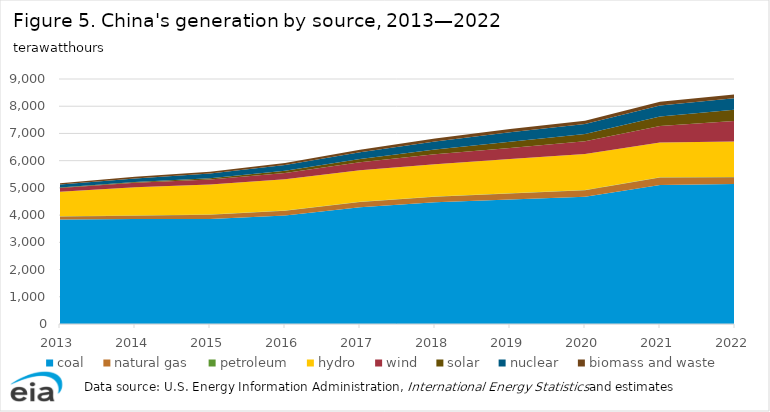
| Category | coal | natural gas | petroleum | hydro | wind | solar | nuclear | biomass and waste |
|---|---|---|---|---|---|---|---|---|
| 2013.0 | 3837.707 | 109.547 | 9.424 | 900.515 | 141.197 | 15.477 | 111.61 | 49.303 |
| 2014.0 | 3853.978 | 122.213 | 8.727 | 1040.626 | 159.979 | 29.23 | 132.54 | 57.356 |
| 2015.0 | 3853.377 | 158.954 | 9.218 | 1103.325 | 185.766 | 44.809 | 170.79 | 63.729 |
| 2016.0 | 3981.246 | 180.348 | 9.93 | 1141.716 | 237.07 | 75.344 | 213.29 | 76.113 |
| 2017.0 | 4285.387 | 196.565 | 9.547 | 1153.461 | 297.23 | 117.842 | 248.07 | 92.816 |
| 2018.0 | 4471.577 | 202.276 | 10.195 | 1186.898 | 365.971 | 177.28 | 294.36 | 103.207 |
| 2019.0 | 4573.457 | 219.009 | 9.918 | 1259.813 | 406.032 | 225.395 | 348.35 | 121.143 |
| 2020.0 | 4675.296 | 239.846 | 10.895 | 1321.511 | 466.462 | 262.184 | 366.25 | 124.262 |
| 2021.0 | 5105.576 | 275.072 | 11.306 | 1274.63 | 611.221 | 340.862 | 407.52 | 136.434 |
| 2022.0 | 5144.76 | 245.292 | 11.975 | 1300.452 | 758.072 | 416.271 | 417.786 | 138.443 |